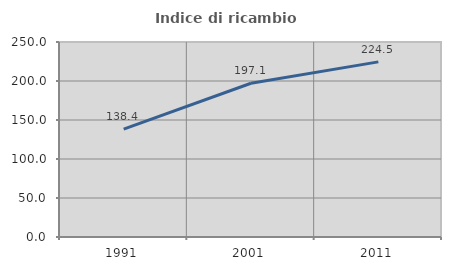
| Category | Indice di ricambio occupazionale  |
|---|---|
| 1991.0 | 138.404 |
| 2001.0 | 197.086 |
| 2011.0 | 224.514 |